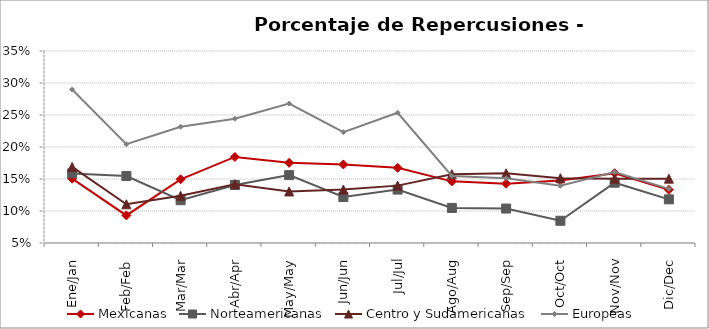
| Category | Mexicanas | Norteamericanas | Centro y Sudamericanas | Europeas |
|---|---|---|---|---|
| Ene/Jan | 0.15 | 0.159 | 0.169 | 0.29 |
| Feb/Feb | 0.093 | 0.155 | 0.11 | 0.204 |
| Mar/Mar | 0.15 | 0.117 | 0.124 | 0.232 |
| Abr/Apr | 0.184 | 0.141 | 0.142 | 0.244 |
| May/May | 0.175 | 0.156 | 0.131 | 0.268 |
| Jun/Jun | 0.173 | 0.122 | 0.134 | 0.223 |
| Jul/Jul | 0.167 | 0.133 | 0.14 | 0.254 |
| Ago/Aug | 0.146 | 0.105 | 0.157 | 0.155 |
| Sep/Sep | 0.143 | 0.104 | 0.159 | 0.151 |
| Oct/Oct | 0.148 | 0.085 | 0.151 | 0.139 |
| Nov/Nov | 0.159 | 0.144 | 0.151 | 0.161 |
| Dic/Dec | 0.133 | 0.118 | 0.151 | 0.135 |